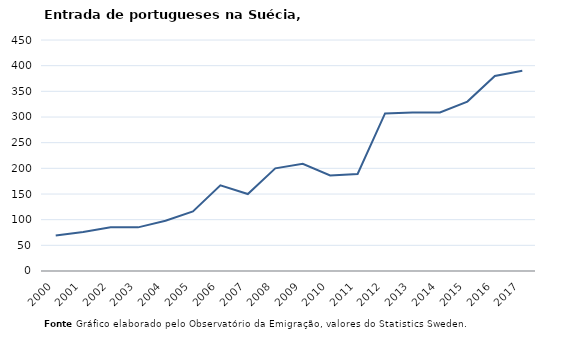
| Category | Entradas |
|---|---|
| 2000.0 | 69 |
| 2001.0 | 76 |
| 2002.0 | 85 |
| 2003.0 | 85 |
| 2004.0 | 98 |
| 2005.0 | 116 |
| 2006.0 | 167 |
| 2007.0 | 150 |
| 2008.0 | 200 |
| 2009.0 | 209 |
| 2010.0 | 186 |
| 2011.0 | 189 |
| 2012.0 | 307 |
| 2013.0 | 309 |
| 2014.0 | 309 |
| 2015.0 | 330 |
| 2016.0 | 380 |
| 2017.0 | 390 |